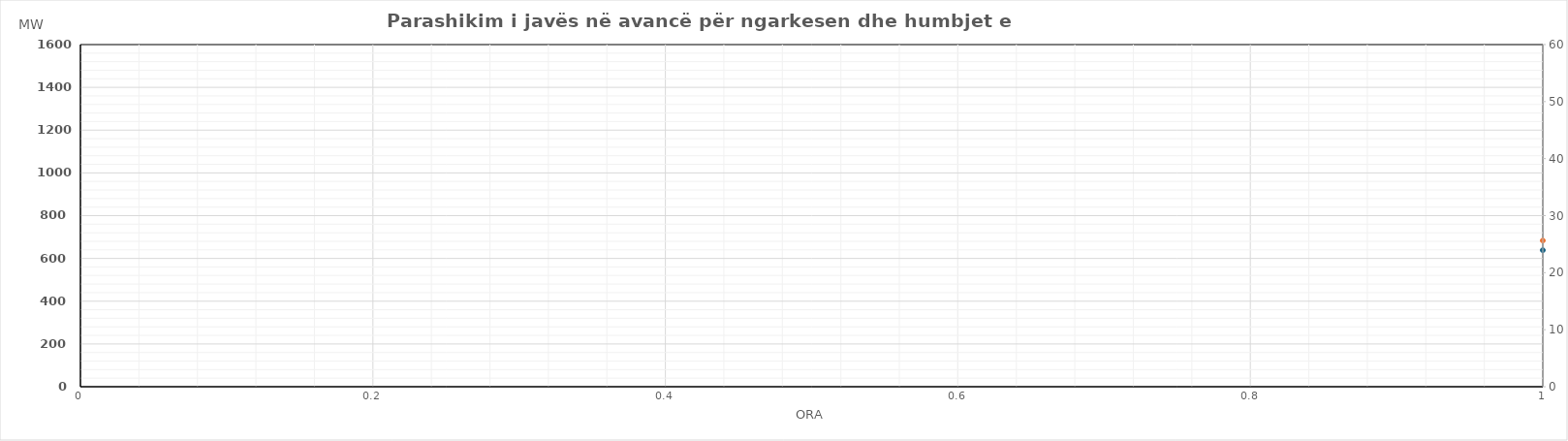
| Category | Ngarkesa (MWh) |
|---|---|
| 0 | 683.722 |
| 1 | 591.363 |
| 2 | 551.911 |
| 3 | 535.425 |
| 4 | 549.209 |
| 5 | 614.398 |
| 6 | 832.792 |
| 7 | 1134.017 |
| 8 | 1230.066 |
| 9 | 1215.566 |
| 10 | 1138.039 |
| 11 | 1095.887 |
| 12 | 1079.186 |
| 13 | 1102.834 |
| 14 | 1136.575 |
| 15 | 1163.173 |
| 16 | 1238.932 |
| 17 | 1389.942 |
| 18 | 1437.416 |
| 19 | 1437.656 |
| 20 | 1401.795 |
| 21 | 1279.996 |
| 22 | 1093.202 |
| 23 | 880.103 |
| 24 | 710.765 |
| 25 | 624.112 |
| 26 | 588.022 |
| 27 | 579.942 |
| 28 | 591.845 |
| 29 | 665.315 |
| 30 | 872.743 |
| 31 | 1178.977 |
| 32 | 1280.124 |
| 33 | 1268.248 |
| 34 | 1274.187 |
| 35 | 1266.931 |
| 36 | 1274.107 |
| 37 | 1286.605 |
| 38 | 1303.895 |
| 39 | 1320.422 |
| 40 | 1368.107 |
| 41 | 1485.269 |
| 42 | 1507.432 |
| 43 | 1500.724 |
| 44 | 1469.655 |
| 45 | 1344.643 |
| 46 | 1147.825 |
| 47 | 953.993 |
| 48 | 786.863 |
| 49 | 652.237 |
| 50 | 593.128 |
| 51 | 578.224 |
| 52 | 587.721 |
| 53 | 658.338 |
| 54 | 868.311 |
| 55 | 1174.05 |
| 56 | 1265.561 |
| 57 | 1248.432 |
| 58 | 1166.476 |
| 59 | 1108.789 |
| 60 | 1097.489 |
| 61 | 1121.131 |
| 62 | 1151.536 |
| 63 | 1180.459 |
| 64 | 1266.981 |
| 65 | 1423.909 |
| 66 | 1470.115 |
| 67 | 1461.371 |
| 68 | 1435.408 |
| 69 | 1304.157 |
| 70 | 1095.681 |
| 71 | 865.601 |
| 72 | 701.981 |
| 73 | 612.662 |
| 74 | 563.588 |
| 75 | 558.409 |
| 76 | 568.52 |
| 77 | 642.365 |
| 78 | 857.845 |
| 79 | 1155.386 |
| 80 | 1252.181 |
| 81 | 1228.83 |
| 82 | 1157.958 |
| 83 | 1100.005 |
| 84 | 1076.989 |
| 85 | 1123.529 |
| 86 | 1179.308 |
| 87 | 1206.152 |
| 88 | 1251.6 |
| 89 | 1389.592 |
| 90 | 1436.603 |
| 91 | 1429.372 |
| 92 | 1394.847 |
| 93 | 1274.191 |
| 94 | 1067.66 |
| 95 | 850.567 |
| 96 | 692.335 |
| 97 | 607.593 |
| 98 | 575.375 |
| 99 | 560.681 |
| 100 | 577.56 |
| 101 | 654.727 |
| 102 | 875.143 |
| 103 | 1172.107 |
| 104 | 1249.338 |
| 105 | 1214.235 |
| 106 | 1140.334 |
| 107 | 1083.034 |
| 108 | 1056.933 |
| 109 | 1071.987 |
| 110 | 1105.308 |
| 111 | 1134.278 |
| 112 | 1206.33 |
| 113 | 1356.84 |
| 114 | 1406.349 |
| 115 | 1395.333 |
| 116 | 1364.631 |
| 117 | 1257.189 |
| 118 | 1071.263 |
| 119 | 869.375 |
| 120 | 709.093 |
| 121 | 621.913 |
| 122 | 582.457 |
| 123 | 569.166 |
| 124 | 577.969 |
| 125 | 642.421 |
| 126 | 790.949 |
| 127 | 1012.601 |
| 128 | 1206.177 |
| 129 | 1237.958 |
| 130 | 1163.212 |
| 131 | 1100.256 |
| 132 | 1078.431 |
| 133 | 1082.617 |
| 134 | 1094.388 |
| 135 | 1122.819 |
| 136 | 1202.541 |
| 137 | 1354.925 |
| 138 | 1409.015 |
| 139 | 1394.586 |
| 140 | 1355.058 |
| 141 | 1249.442 |
| 142 | 1084.547 |
| 143 | 916.028 |
| 144 | 771.546 |
| 145 | 649.202 |
| 146 | 584.045 |
| 147 | 563.4 |
| 148 | 561.719 |
| 149 | 604.578 |
| 150 | 707.872 |
| 151 | 895.626 |
| 152 | 1058.777 |
| 153 | 1111.334 |
| 154 | 1093.61 |
| 155 | 1064.444 |
| 156 | 1065.617 |
| 157 | 1081.232 |
| 158 | 1087.957 |
| 159 | 1124.896 |
| 160 | 1230.792 |
| 161 | 1401.942 |
| 162 | 1469.486 |
| 163 | 1468.588 |
| 164 | 1414.887 |
| 165 | 1290.328 |
| 166 | 1084.946 |
| 167 | 859.324 |